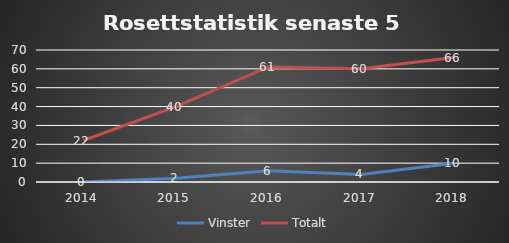
| Category | Vinster | Totalt |
|---|---|---|
| 2014.0 | 0 | 22 |
| 2015.0 | 2 | 40 |
| 2016.0 | 6 | 61 |
| 2017.0 | 4 | 60 |
| 2018.0 | 10 | 66 |